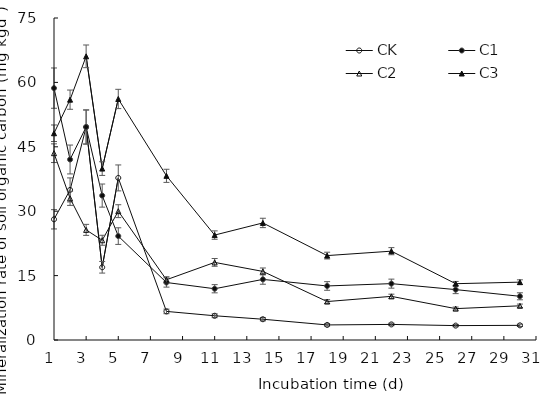
| Category | CK | C1 | C2 | C3 |
|---|---|---|---|---|
| 1.0 | 28.111 | 58.667 | 43.511 | 48.156 |
| 2.0 | 34.956 | 42.044 | 33 | 55.978 |
| 3.0 | 49.61 | 49.61 | 25.65 | 66.07 |
| 4.0 | 16.94 | 33.638 | 23.232 | 39.93 |
| 5.0 | 37.752 | 24.2 | 30.008 | 56.143 |
| 8.0 | 6.66 | 13.39 | 14.037 | 38.237 |
| 11.0 | 5.647 | 11.94 | 18.077 | 24.44 |
| 14.0 | 4.84 | 14.117 | 15.973 | 27.267 |
| 18.0 | 3.51 | 12.585 | 8.955 | 19.662 |
| 22.0 | 3.63 | 13.128 | 10.164 | 20.691 |
| 26.0 | 3.354 | 11.738 | 7.307 | 13.116 |
| 30.0 | 3.414 | 10.181 | 7.965 | 13.475 |